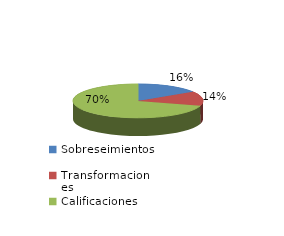
| Category | Series 0 |
|---|---|
| Sobreseimientos | 690 |
| Transformaciones | 594 |
| Calificaciones | 3045 |